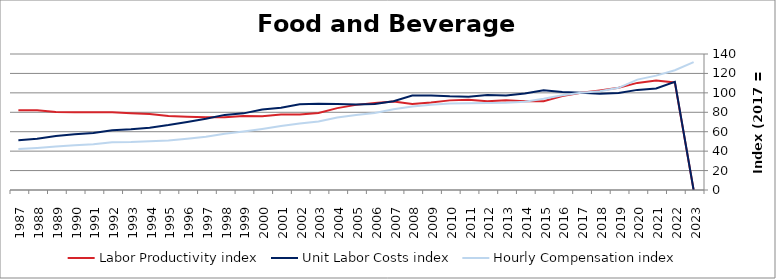
| Category | Labor Productivity index | Unit Labor Costs index | Hourly Compensation index |
|---|---|---|---|
| 2023.0 | 0 | 0 | 131.628 |
| 2022.0 | 110.639 | 111.401 | 123.253 |
| 2021.0 | 112.627 | 104.523 | 117.721 |
| 2020.0 | 110.265 | 103.06 | 113.639 |
| 2019.0 | 105.297 | 99.898 | 105.19 |
| 2018.0 | 102.442 | 99.177 | 101.598 |
| 2017.0 | 100 | 100 | 100 |
| 2016.0 | 96.7 | 100.974 | 97.642 |
| 2015.0 | 91.486 | 102.641 | 93.903 |
| 2014.0 | 91.459 | 99.364 | 90.877 |
| 2013.0 | 92.357 | 97.255 | 89.821 |
| 2012.0 | 91.45 | 97.868 | 89.5 |
| 2011.0 | 92.947 | 96.024 | 89.252 |
| 2010.0 | 92.263 | 96.428 | 88.967 |
| 2009.0 | 90.134 | 97.343 | 87.739 |
| 2008.0 | 88.504 | 97.233 | 86.055 |
| 2007.0 | 90.994 | 91.443 | 83.208 |
| 2006.0 | 89.434 | 88.61 | 79.248 |
| 2005.0 | 87.636 | 88.059 | 77.171 |
| 2004.0 | 84.287 | 88.584 | 74.665 |
| 2003.0 | 79.362 | 88.734 | 70.421 |
| 2002.0 | 77.656 | 88.249 | 68.531 |
| 2001.0 | 77.675 | 84.719 | 65.805 |
| 2000.0 | 75.914 | 82.865 | 62.906 |
| 1999.0 | 76.27 | 78.887 | 60.167 |
| 1998.0 | 74.78 | 77.317 | 57.817 |
| 1997.0 | 74.834 | 73.257 | 54.821 |
| 1996.0 | 75.423 | 70.087 | 52.861 |
| 1995.0 | 76.183 | 66.8 | 50.891 |
| 1994.0 | 78.124 | 64.1 | 50.077 |
| 1993.0 | 78.883 | 62.508 | 49.308 |
| 1992.0 | 79.945 | 61.485 | 49.155 |
| 1991.0 | 79.971 | 58.8 | 47.023 |
| 1990.0 | 80.079 | 57.457 | 46.011 |
| 1989.0 | 80.335 | 55.66 | 44.714 |
| 1988.0 | 82.068 | 52.724 | 43.269 |
| 1987.0 | 82.207 | 51.251 | 42.132 |